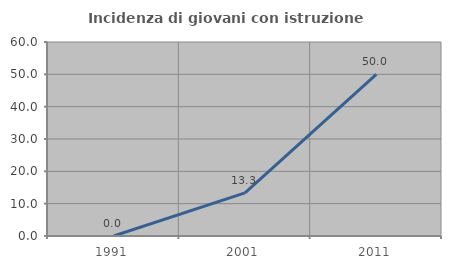
| Category | Incidenza di giovani con istruzione universitaria |
|---|---|
| 1991.0 | 0 |
| 2001.0 | 13.333 |
| 2011.0 | 50 |